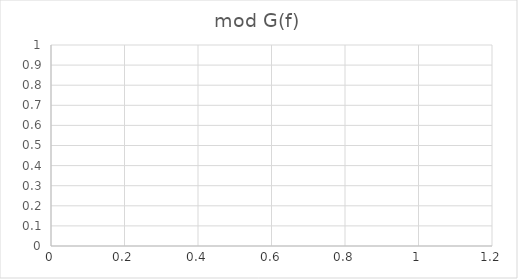
| Category | mod G(f) |
|---|---|
|  | 0 |
|  | 0 |
|  | 0 |
|  | 0 |
|  | 0 |
|  | 0 |
|  | 0 |
|  | 0 |
|  | 0 |
|  | 0 |
|  | 0 |
|  | 0 |
|  | 0 |
|  | 0 |
|  | 0 |
|  | 0 |